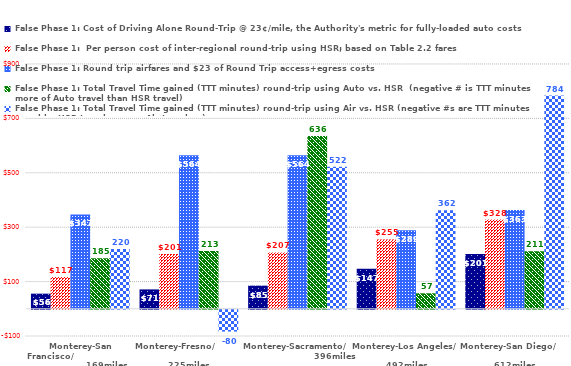
| Category | False Phase 1: Cost of Driving Alone Round-Trip @ 23¢/mile, the Authority's metric for fully-loaded auto costs | False Phase 1:  Per person cost of inter-regional round-trip using HSR; based on Table 2.2 fares | False Phase 1: Round trip airfares and $23 of Round Trip access+egress costs | False Phase 1: Total Travel Time gained (TTT minutes) round-trip using Auto vs. HSR  (negative # is TTT minutes more of Auto travel than HSR travel) | False Phase 1: Total Travel Time gained (TTT minutes) round-trip using Air vs. HSR (negative #s are TTT minutes saved by HSR travelers over Air travelers) |
|---|---|---|---|---|---|
| Monterey-San Francisco/                                       169miles | 55.66 | 117 | 347 | 185.4 | 220 |
| Monterey-Fresno/                                    225miles | 71.3 | 201 | 564 | 212.8 | -80 |
| Monterey-Sacramento/                          396miles | 85.1 | 207 | 564 | 635.5 | 522 |
| Monterey-Los Angeles/                                           492miles | 147.2 | 255 | 289 | 57 | 362 |
| Monterey-San Diego/                                612miles | 201.48 | 328 | 363 | 211.4 | 784 |